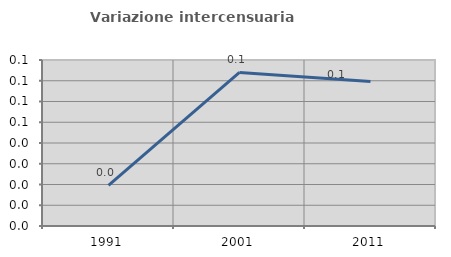
| Category | Variazione intercensuaria annua |
|---|---|
| 1991.0 | 0.02 |
| 2001.0 | 0.074 |
| 2011.0 | 0.07 |